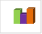
| Category | област София (столица) |
|---|---|
| летен сезон 2019  | 744356 |
| летен сезон 2021  | 522316 |
| летен сезон 2022 г.  | 802979 |